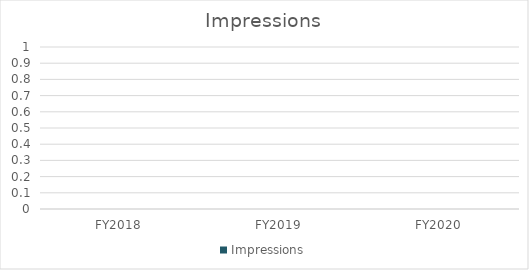
| Category | Impressions |
|---|---|
| FY2018 | 0 |
| FY2019 | 0 |
| FY2020 | 0 |